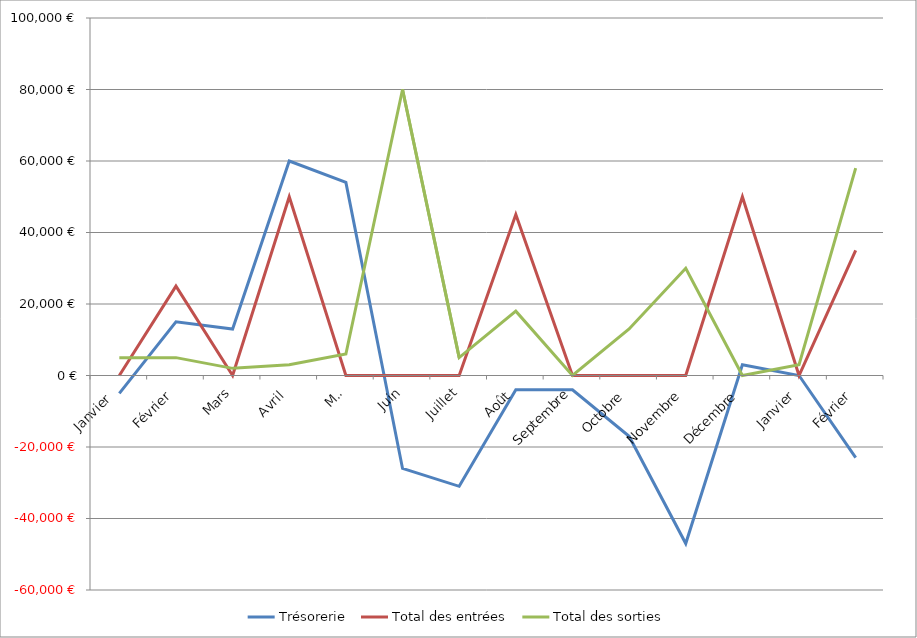
| Category | Trésorerie  | Total des entrées  | Total des sorties |
|---|---|---|---|
| Janvier  | -5000 | 0 | 5000 |
| Février | 15000 | 25000 | 5000 |
| Mars | 13000 | 0 | 2000 |
| Avril | 60000 | 50000 | 3000 |
| Mai | 54000 | 0 | 6000 |
| Juin | -26000 | 0 | 80000 |
| Juillet | -31000 | 0 | 5000 |
| Août | -4000 | 45000 | 18000 |
| Septembre | -4000 | 0 | 0 |
| Octobre | -17000 | 0 | 13000 |
| Novembre | -47000 | 0 | 30000 |
| Décembre | 3000 | 50000 | 0 |
| Janvier | 0 | 0 | 3000 |
| Février | -23000 | 35000 | 58000 |